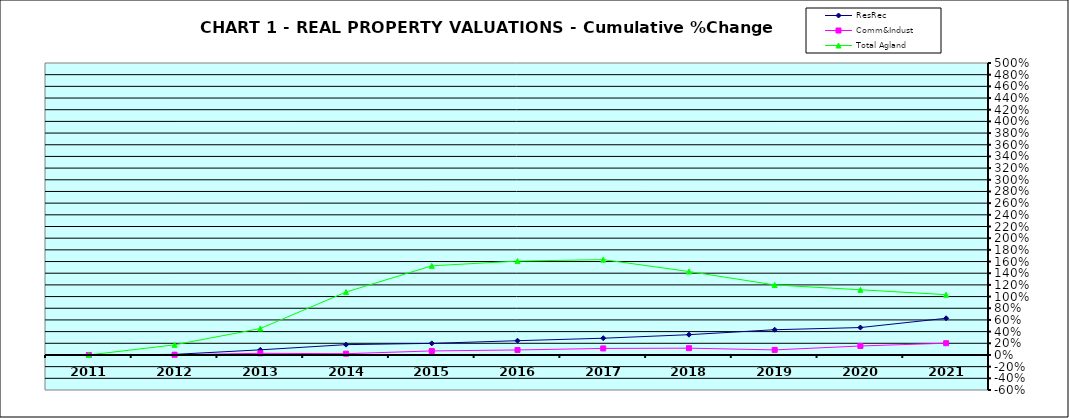
| Category | ResRec | Comm&Indust | Total Agland |
|---|---|---|---|
| 2011.0 | 0 | 0 | 0 |
| 2012.0 | 0.01 | 0.003 | 0.173 |
| 2013.0 | 0.088 | 0.028 | 0.453 |
| 2014.0 | 0.177 | 0.022 | 1.077 |
| 2015.0 | 0.199 | 0.069 | 1.526 |
| 2016.0 | 0.244 | 0.086 | 1.608 |
| 2017.0 | 0.287 | 0.112 | 1.633 |
| 2018.0 | 0.347 | 0.116 | 1.429 |
| 2019.0 | 0.432 | 0.087 | 1.199 |
| 2020.0 | 0.469 | 0.154 | 1.116 |
| 2021.0 | 0.628 | 0.201 | 1.032 |